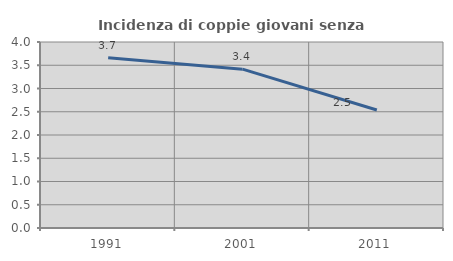
| Category | Incidenza di coppie giovani senza figli |
|---|---|
| 1991.0 | 3.662 |
| 2001.0 | 3.415 |
| 2011.0 | 2.539 |